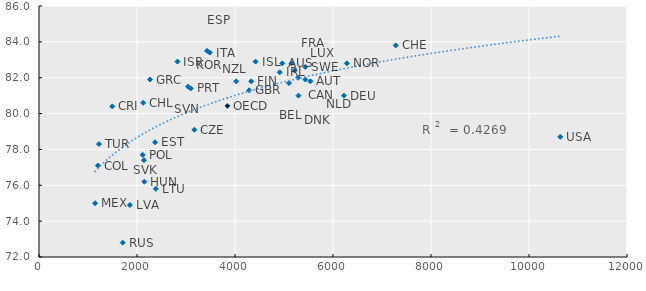
| Category | Espérance de vie à la naissance |
|---|---|
| 4964.533 | 82.8 |
| 5538.347 | 81.8 |
| 5103.2 | 81.7 |
| 5287.406 | 82 |
| 3170.668 | 79.1 |
| 5294.51 | 81 |
| 4331.459 | 81.8 |
| 5154.119 | 82.8 |
| 6223.787 | 81 |
| 2265.899 | 81.9 |
| 2149.72 | 76.2 |
| 4419.913 | 82.9 |
| 4911.848 | 82.3 |
| 3484.935 | 83.4 |
| 3085.18 | 82.7 |
| 5216.284 | 82.4 |
| 1144.895 | 75 |
| 5436.287 | 81.9 |
| 4024.552 | 81.8 |
| 6283.17 | 82.8 |
| 2113.702 | 77.7 |
| 3097.301 | 81.4 |
| 2142.079 | 77.4 |
| 3429.798 | 83.5 |
| 5433.728 | 82.6 |
| 7279.792 | 83.8 |
| 1223.568 | 78.3 |
| 4289.787 | 81.3 |
| 10637.142 | 78.7 |
| 2125.946 | 80.6 |
| 2368.125 | 78.4 |
| 2825.783 | 82.9 |
| 1707.434 | 72.8 |
| 3042.262 | 81.5 |
| 1201.086 | 77.1 |
| 1856.485 | 74.9 |
| 2385.085 | 75.8 |
| 1495.549 | 80.4 |
| 3845.9306315789468 | 80.432 |